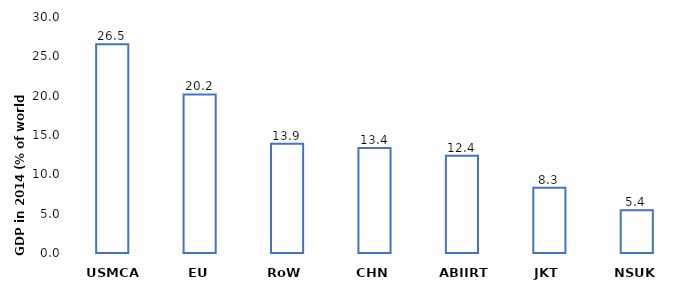
| Category | Series 0 |
|---|---|
| USMCA | 26.534 |
| EU | 20.155 |
| RoW | 13.883 |
| CHN | 13.358 |
| ABIIRT | 12.363 |
| JKT | 8.281 |
| NSUK | 5.425 |